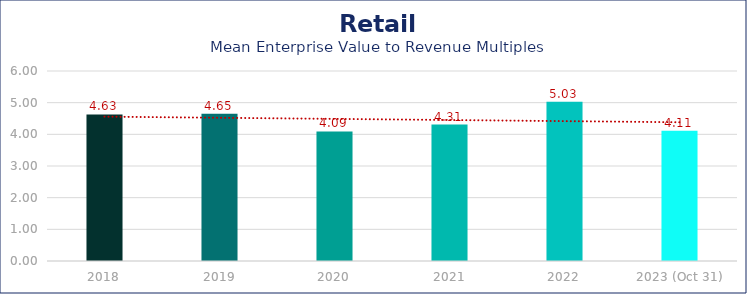
| Category | Retail |
|---|---|
| 2018 | 4.63 |
| 2019 | 4.65 |
| 2020 | 4.09 |
| 2021 | 4.31 |
| 2022 | 5.03 |
| 2023 (Oct 31) | 4.11 |